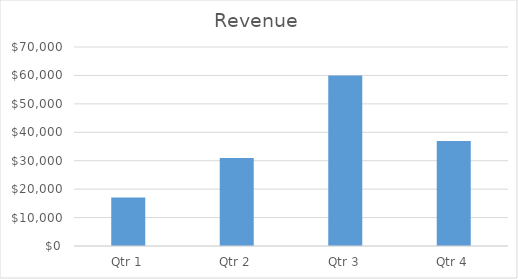
| Category | Revenue |
|---|---|
| Qtr 1 | 17055 |
| Qtr 2 | 30926 |
| Qtr 3 | 59987 |
| Qtr 4 | 36972 |